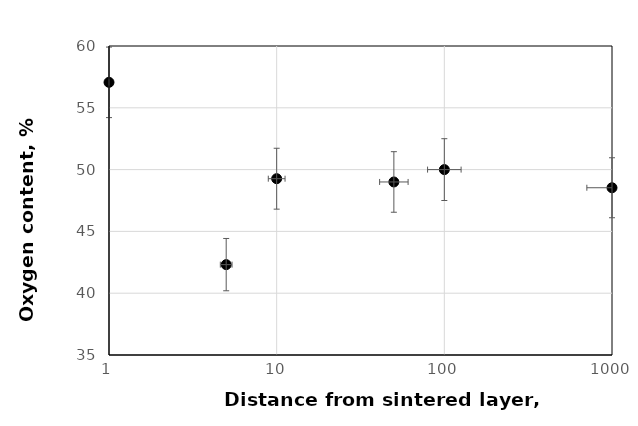
| Category | O |
|---|---|
| 1.0 | 57.06 |
| 5.0 | 42.311 |
| 10.0 | 49.264 |
| 50.0 | 49 |
| 100.0 | 50 |
| 1000.0 | 48.532 |